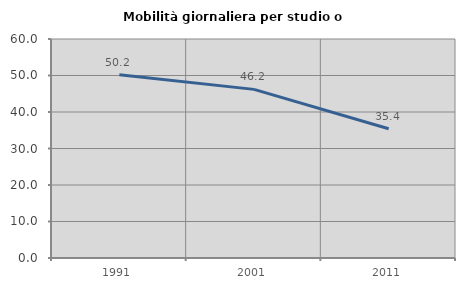
| Category | Mobilità giornaliera per studio o lavoro |
|---|---|
| 1991.0 | 50.226 |
| 2001.0 | 46.199 |
| 2011.0 | 35.404 |